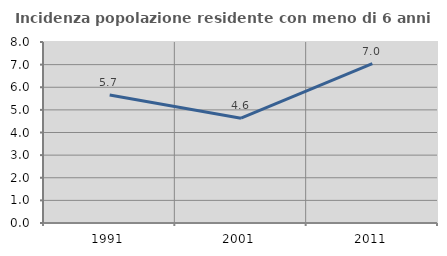
| Category | Incidenza popolazione residente con meno di 6 anni |
|---|---|
| 1991.0 | 5.658 |
| 2001.0 | 4.634 |
| 2011.0 | 7.042 |